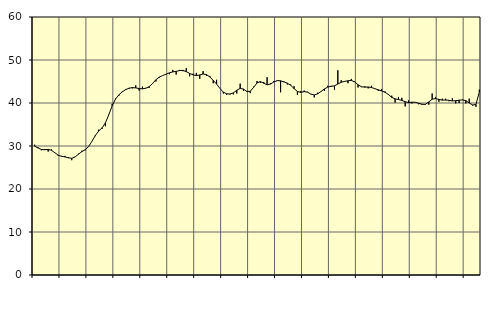
| Category | Piggar | Series 1 |
|---|---|---|
| nan | 30.3 | 29.95 |
| 87.0 | 29.7 | 29.53 |
| 87.0 | 29 | 29.19 |
| 87.0 | 29.3 | 29.13 |
| nan | 28.7 | 29.21 |
| 88.0 | 29.2 | 29 |
| 88.0 | 28.4 | 28.42 |
| 88.0 | 27.7 | 27.85 |
| nan | 27.7 | 27.6 |
| 89.0 | 27.7 | 27.47 |
| 89.0 | 27.4 | 27.25 |
| 89.0 | 26.7 | 27.14 |
| nan | 27.5 | 27.45 |
| 90.0 | 28.2 | 28.09 |
| 90.0 | 28.9 | 28.69 |
| 90.0 | 29 | 29.15 |
| nan | 29.8 | 29.87 |
| 91.0 | 31.1 | 31.07 |
| 91.0 | 32.3 | 32.44 |
| 91.0 | 33.8 | 33.48 |
| nan | 34 | 34.22 |
| 92.0 | 34.6 | 35.38 |
| 92.0 | 37.2 | 37.26 |
| 92.0 | 39.8 | 39.34 |
| nan | 41 | 40.92 |
| 93.0 | 41.7 | 41.9 |
| 93.0 | 42.7 | 42.6 |
| 93.0 | 43.2 | 43.1 |
| nan | 43.3 | 43.45 |
| 94.0 | 43.4 | 43.59 |
| 94.0 | 44.1 | 43.51 |
| 94.0 | 42.9 | 43.37 |
| nan | 43.8 | 43.29 |
| 95.0 | 43.5 | 43.44 |
| 95.0 | 43.5 | 43.81 |
| 95.0 | 44.6 | 44.54 |
| nan | 45 | 45.42 |
| 96.0 | 45.9 | 46.04 |
| 96.0 | 46.4 | 46.38 |
| 96.0 | 46.7 | 46.7 |
| nan | 46.7 | 47.02 |
| 97.0 | 47.7 | 47.23 |
| 97.0 | 46.6 | 47.36 |
| 97.0 | 47.7 | 47.54 |
| nan | 47.4 | 47.59 |
| 98.0 | 48.1 | 47.29 |
| 98.0 | 46.2 | 46.88 |
| 98.0 | 46.8 | 46.54 |
| nan | 47 | 46.38 |
| 99.0 | 45.6 | 46.52 |
| 99.0 | 47.4 | 46.74 |
| 99.0 | 46.3 | 46.62 |
| nan | 46.3 | 46.04 |
| 0.0 | 44.6 | 45.27 |
| 0.0 | 45.4 | 44.41 |
| 0.0 | 43.4 | 43.39 |
| nan | 42.2 | 42.53 |
| 1.0 | 41.9 | 42.14 |
| 1.0 | 42 | 42.09 |
| 1.0 | 42 | 42.36 |
| nan | 42.2 | 42.97 |
| 2.0 | 44.5 | 43.4 |
| 2.0 | 42.8 | 43.23 |
| 2.0 | 42.8 | 42.67 |
| nan | 42.3 | 42.72 |
| 3.0 | 43.8 | 43.64 |
| 3.0 | 45.1 | 44.66 |
| 3.0 | 44.7 | 45 |
| nan | 44.9 | 44.59 |
| 4.0 | 46 | 44.24 |
| 4.0 | 44.6 | 44.41 |
| 4.0 | 45.1 | 44.88 |
| nan | 45.3 | 45.2 |
| 5.0 | 42.5 | 45.17 |
| 5.0 | 45 | 44.9 |
| 5.0 | 44.3 | 44.61 |
| nan | 44.3 | 44.13 |
| 6.0 | 43.9 | 43.35 |
| 6.0 | 41.9 | 42.68 |
| 6.0 | 42.8 | 42.47 |
| nan | 42.9 | 42.64 |
| 7.0 | 42.6 | 42.53 |
| 7.0 | 42.1 | 42.06 |
| 7.0 | 41.3 | 41.88 |
| nan | 42.4 | 42.13 |
| 8.0 | 42.7 | 42.67 |
| 8.0 | 42.8 | 43.26 |
| 8.0 | 44 | 43.7 |
| nan | 44 | 43.87 |
| 9.0 | 43.1 | 44 |
| 9.0 | 47.6 | 44.41 |
| 9.0 | 45.3 | 44.83 |
| nan | 45.1 | 45.02 |
| 10.0 | 44.6 | 45.17 |
| 10.0 | 45.6 | 45.24 |
| 10.0 | 45 | 44.91 |
| nan | 43.6 | 44.24 |
| 11.0 | 43.7 | 43.78 |
| 11.0 | 43.9 | 43.69 |
| 11.0 | 43.4 | 43.72 |
| nan | 44 | 43.61 |
| 12.0 | 43.3 | 43.33 |
| 12.0 | 42.8 | 43.06 |
| 12.0 | 43.2 | 42.79 |
| nan | 42.7 | 42.5 |
| 13.0 | 41.9 | 41.98 |
| 13.0 | 41.7 | 41.31 |
| 13.0 | 40.1 | 40.96 |
| nan | 41.4 | 40.81 |
| 14.0 | 41.2 | 40.61 |
| 14.0 | 39.2 | 40.29 |
| 14.0 | 40.6 | 40.09 |
| nan | 39.9 | 40.19 |
| 15.0 | 40.2 | 40.17 |
| 15.0 | 39.7 | 39.94 |
| 15.0 | 39.8 | 39.69 |
| nan | 39.6 | 39.69 |
| 16.0 | 39.6 | 40.25 |
| 16.0 | 42.2 | 40.88 |
| 16.0 | 41.4 | 41.03 |
| nan | 40.3 | 40.83 |
| 17.0 | 41 | 40.67 |
| 17.0 | 41 | 40.68 |
| 17.0 | 40.4 | 40.63 |
| nan | 41.1 | 40.49 |
| 18.0 | 39.9 | 40.54 |
| 18.0 | 40 | 40.65 |
| 18.0 | 40.8 | 40.71 |
| nan | 39.9 | 40.56 |
| 19.0 | 41 | 40 |
| 19.0 | 39.4 | 39.55 |
| 19.0 | 39.1 | 39.64 |
| nan | 43.1 | 42.53 |